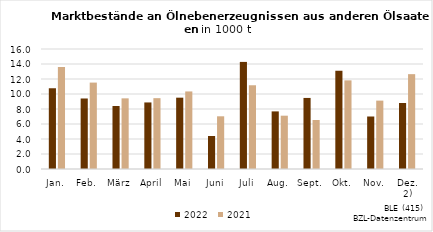
| Category | 2022 | 2021 |
|---|---|---|
| Jan. | 10.766 | 13.614 |
| Feb. | 9.402 | 11.522 |
| März | 8.397 | 9.42 |
| April | 8.874 | 9.445 |
| Mai | 9.51 | 10.341 |
| Juni | 4.404 | 7.026 |
| Juli | 14.279 | 11.165 |
| Aug. | 7.681 | 7.109 |
| Sept. | 9.475 | 6.536 |
| Okt. | 13.1 | 11.819 |
| Nov. | 7 | 9.117 |
| Dez. 2) | 8.799 | 12.646 |